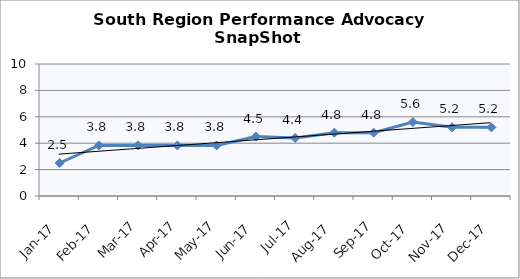
| Category | South Region |
|---|---|
| Jan-17 | 2.5 |
| Feb-17 | 3.833 |
| Mar-17 | 3.833 |
| Apr-17 | 3.833 |
| May-17 | 3.833 |
| Jun-17 | 4.5 |
| Jul-17 | 4.4 |
| Aug-17 | 4.8 |
| Sep-17 | 4.8 |
| Oct-17 | 5.6 |
| Nov-17 | 5.2 |
| Dec-17 | 5.2 |